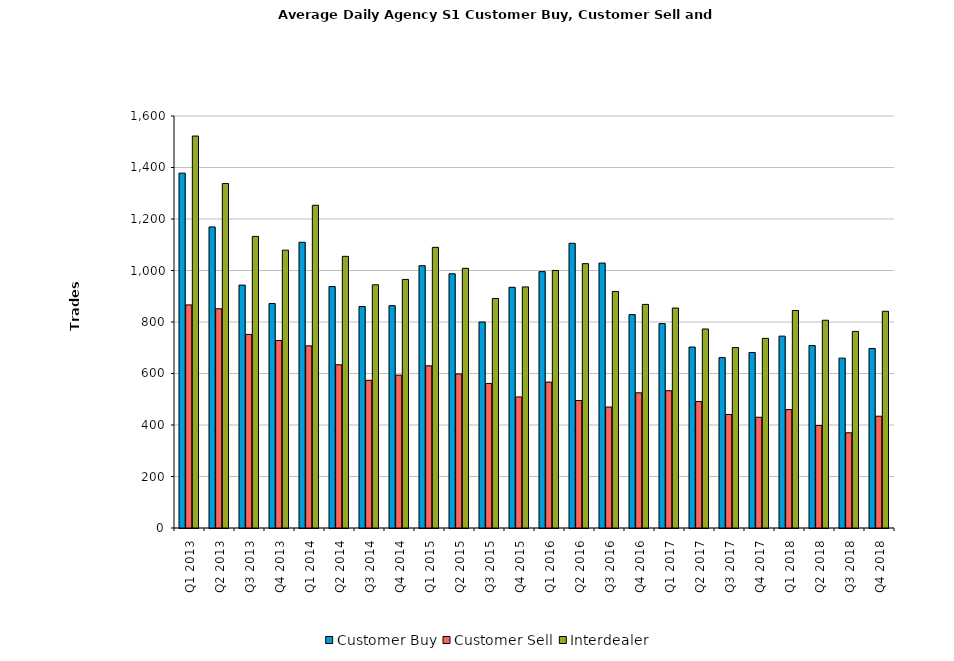
| Category | Customer Buy | Customer Sell | Interdealer |
|---|---|---|---|
| Q1 2013 | 1378.153 | 866.39 | 1522.169 |
| Q2 2013 | 1169.125 | 851.344 | 1337.641 |
| Q3 2013 | 943.422 | 751.781 | 1132.391 |
| Q4 2013 | 871.625 | 728.125 | 1079 |
| Q1 2014 | 1109.705 | 707.328 | 1253.279 |
| Q2 2014 | 937.619 | 633.714 | 1054.984 |
| Q3 2014 | 860.031 | 573.609 | 944.453 |
| Q4 2014 | 863.531 | 593.469 | 965.375 |
| Q1 2015 | 1018.672 | 629.803 | 1089.902 |
| Q2 2015 | 987.222 | 598.317 | 1008.46 |
| Q3 2015 | 800.078 | 561.359 | 891.312 |
| Q4 2015 | 934.656 | 509 | 936.266 |
| Q1 2016 | 995.656 | 566.607 | 1000.246 |
| Q2 2016 | 1105.578 | 494.969 | 1026.594 |
| Q3 2016 | 1028.922 | 469.828 | 918.625 |
| Q4 2016 | 828.651 | 525.016 | 868.317 |
| Q1 2017 | 793.887 | 533.016 | 854.177 |
| Q2 2017 | 702.762 | 491.206 | 772.857 |
| Q3 2017 | 661.651 | 440.937 | 700.746 |
| Q4 2017 | 681.365 | 430.111 | 736.524 |
| Q1 2018 | 745.098 | 459.869 | 844.754 |
| Q2 2018 | 708.406 | 398.219 | 806.812 |
| Q3 2018 | 659.667 | 369.762 | 763.397 |
| Q4 2018 | 697.19 | 434.127 | 841.746 |